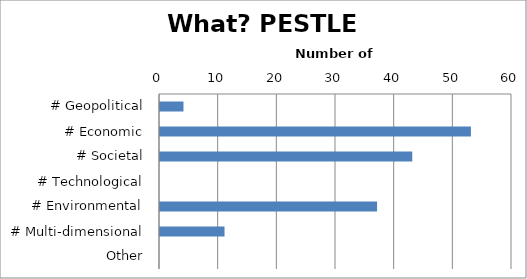
| Category | Series 0 |
|---|---|
| # Geopolitical | 4 |
| # Economic | 53 |
| # Societal | 43 |
| # Technological | 0 |
| # Environmental | 37 |
| # Multi-dimensional | 11 |
| Other | 0 |